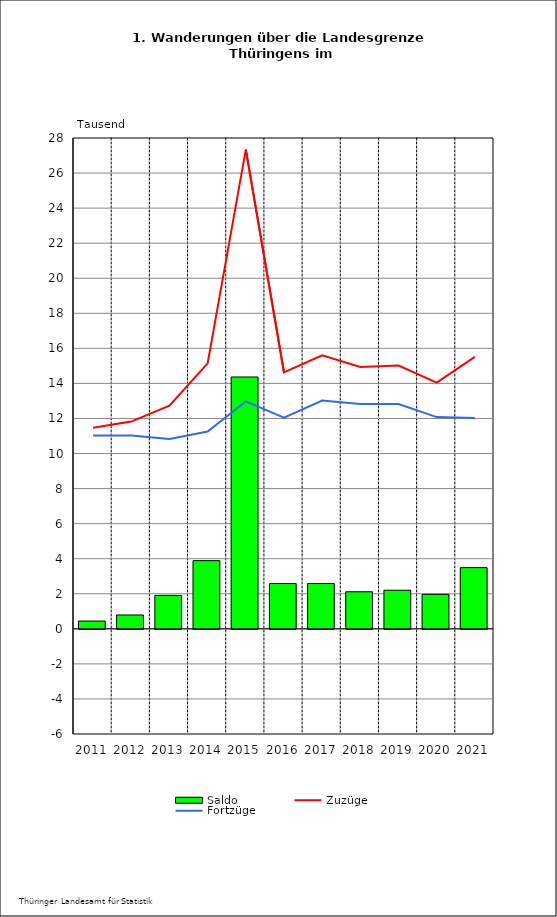
| Category | Saldo |
|---|---|
| 2011.0 | 0.443 |
| 2012.0 | 0.79 |
| 2013.0 | 1.906 |
| 2014.0 | 3.889 |
| 2015.0 | 14.366 |
| 2016.0 | 2.583 |
| 2017.0 | 2.583 |
| 2018.0 | 2.114 |
| 2019.0 | 2.202 |
| 2020.0 | 1.967 |
| 2021.0 | 3.491 |